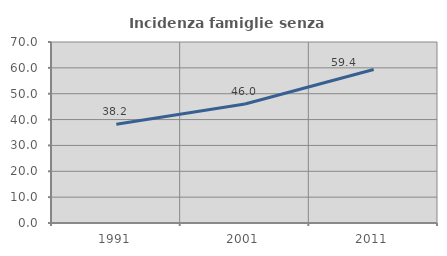
| Category | Incidenza famiglie senza nuclei |
|---|---|
| 1991.0 | 38.191 |
| 2001.0 | 46.023 |
| 2011.0 | 59.375 |